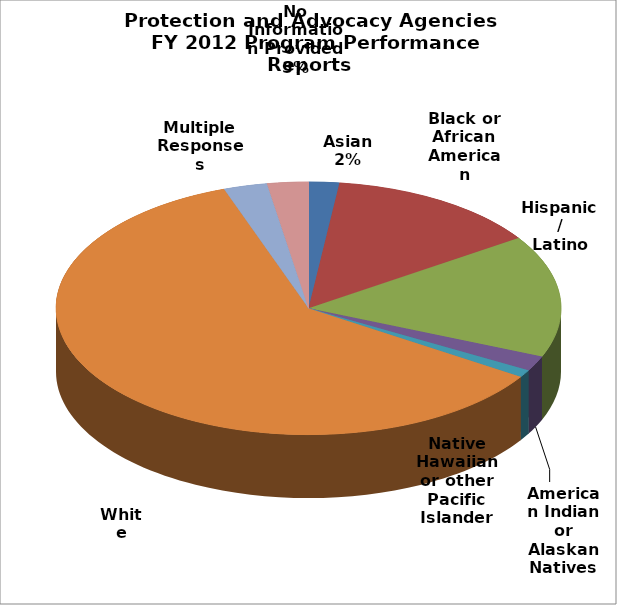
| Category | Series 0 |
|---|---|
| Asian | 0.02 |
| Black or African American | 0.137 |
| Hispanic/Latino | 0.156 |
| American Indian or Alaskan Natives | 0.019 |
| Native Hawaiian or other Pacific Islander | 0.01 |
| White | 0.604 |
| Multiple Responses | 0.028 |
| No Information Provided | 0.026 |